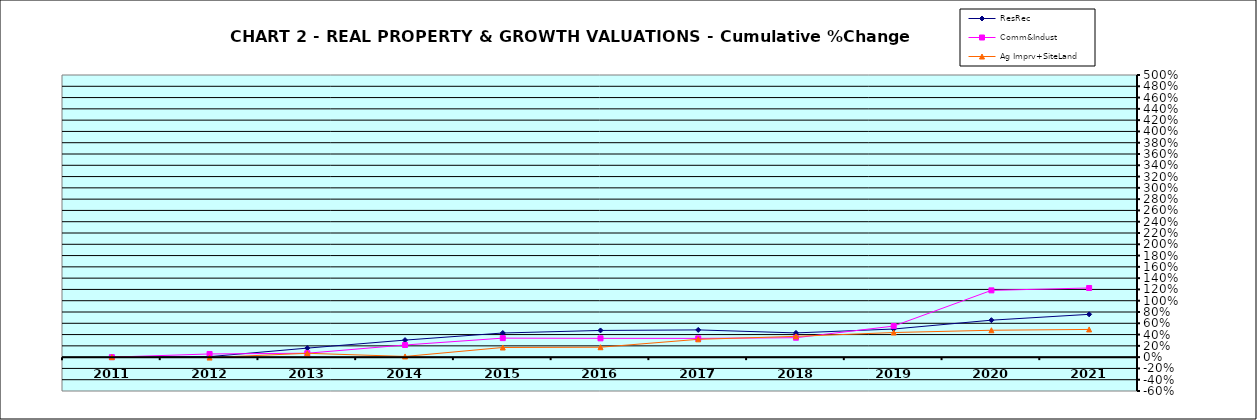
| Category | ResRec | Comm&Indust | Ag Imprv+SiteLand |
|---|---|---|---|
| 2011.0 | 0 | 0 | 0 |
| 2012.0 | 0.009 | 0.056 | -0.007 |
| 2013.0 | 0.16 | 0.069 | 0.068 |
| 2014.0 | 0.302 | 0.215 | 0.012 |
| 2015.0 | 0.428 | 0.337 | 0.171 |
| 2016.0 | 0.473 | 0.333 | 0.176 |
| 2017.0 | 0.483 | 0.332 | 0.316 |
| 2018.0 | 0.43 | 0.344 | 0.368 |
| 2019.0 | 0.498 | 0.551 | 0.436 |
| 2020.0 | 0.655 | 1.183 | 0.476 |
| 2021.0 | 0.759 | 1.225 | 0.491 |